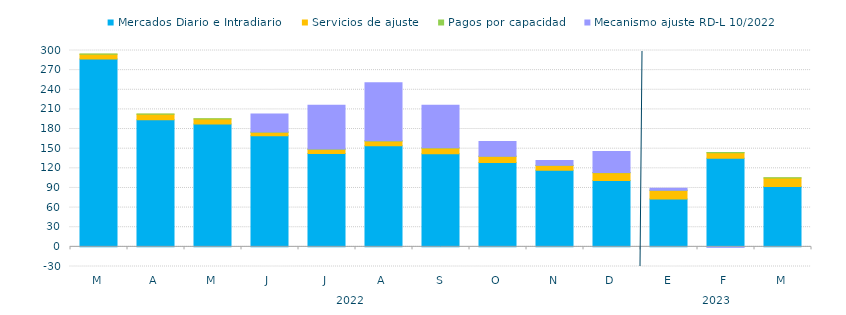
| Category | Mercados Diario e Intradiario  | Servicios de ajuste | Pagos por capacidad | Mecanismo ajuste RD-L 10/2022 |
|---|---|---|---|---|
| M | 287.12 | 7.08 | 0.33 | 0 |
| A | 194.19 | 8.6 | 0.24 | 0 |
| M | 187.7 | 7.81 | 0.23 | 0 |
| J | 169.63 | 5.43 | 0.26 | 27.52 |
| J | 142.79 | 6.39 | 0.44 | 66.88 |
| A | 154.49 | 7.2 | 0.26 | 88.84 |
| S | 142.09 | 9.09 | 0.26 | 64.99 |
| O | 128.7 | 9.63 | 0.21 | 22.46 |
| N | 117.13 | 7.28 | 0.31 | 7.12 |
| D | 101.21 | 12 | 0.43 | 32.1 |
| E | 73.11 | 13.21 | 0.34 | 2.9 |
| F | 135.51 | 8.45 | 0.35 | -0.71 |
| M | 92.223 | 13.01 | 0.243 | 0 |